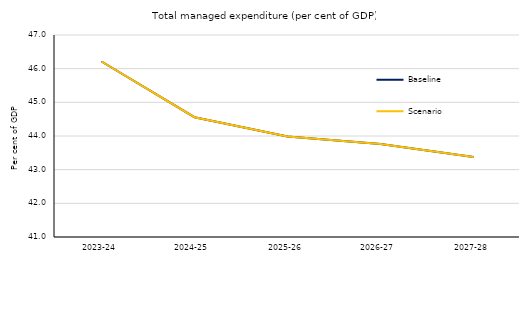
| Category | Baseline | Scenario |
|---|---|---|
| 2023-24 | 46.213 | 46.213 |
| 2024-25 | 44.559 | 44.559 |
| 2025-26 | 43.983 | 43.983 |
| 2026-27 | 43.765 | 43.765 |
| 2027-28 | 43.377 | 43.377 |